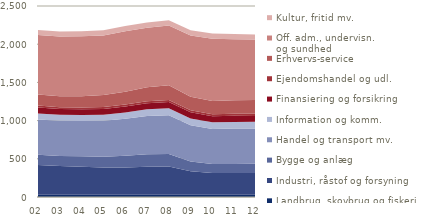
| Category | Landbrug, skovbrug og fiskeri | Industri, råstof og forsyning | Bygge og anlæg | Handel og transport mv. | Information og komm. | Finansiering og forsikring | Ejendomshandel og udl. | Erhvervs-service | Off. adm., undervisn. 
og sundhed | Kultur, fritid mv. |
|---|---|---|---|---|---|---|---|---|---|---|
| 02 | 30.583 | 386.948 | 134.598 | 462.187 | 79.357 | 79.104 | 25.608 | 142.607 | 778.311 | 68.039 |
| 03 | 29.8 | 375.6 | 132.178 | 460.077 | 79.399 | 74.962 | 24.156 | 140.959 | 784.043 | 66.508 |
| 04 | 29.805 | 367.334 | 135.45 | 463.533 | 78.755 | 73.28 | 24.451 | 145.763 | 784.403 | 66.727 |
| 05 | 28.984 | 356.45 | 142.794 | 469.593 | 79.858 | 74.895 | 26.32 | 155.535 | 778.608 | 68.255 |
| 06 | 28.54 | 357.459 | 152.996 | 485.875 | 81.417 | 78.07 | 26.263 | 167.706 | 789.702 | 68.69 |
| 07 | 28.848 | 368.295 | 160.986 | 501.034 | 88.006 | 79.823 | 27.239 | 181.93 | 778.155 | 69.019 |
| 08 | 29.467 | 370.746 | 161.695 | 509.037 | 89.69 | 83.137 | 26.9 | 190.492 | 784.783 | 67.504 |
| 09 | 30.021 | 307.117 | 126.898 | 475.339 | 88.433 | 81.124 | 25.667 | 177.469 | 802.139 | 68.125 |
| 10 | 29.279 | 286.173 | 115.622 | 460.366 | 87.074 | 79.531 | 25.331 | 174.569 | 812.903 | 68.075 |
| 11 | 29.166 | 286.201 | 118.16 | 463.236 | 86.414 | 79.283 | 28.257 | 175.691 | 799.745 | 67.994 |
| 12 | 30.292 | 284.948 | 119.094 | 463.342 | 85.946 | 76.509 | 27.979 | 182.189 | 789.51 | 68.047 |